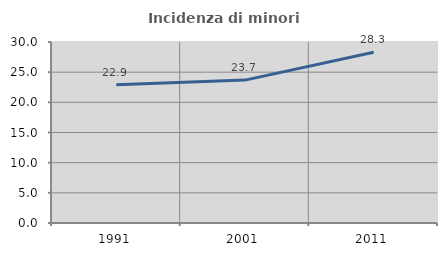
| Category | Incidenza di minori stranieri |
|---|---|
| 1991.0 | 22.917 |
| 2001.0 | 23.684 |
| 2011.0 | 28.291 |